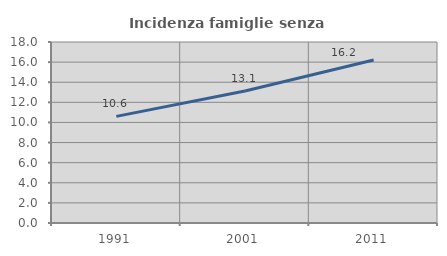
| Category | Incidenza famiglie senza nuclei |
|---|---|
| 1991.0 | 10.603 |
| 2001.0 | 13.132 |
| 2011.0 | 16.211 |